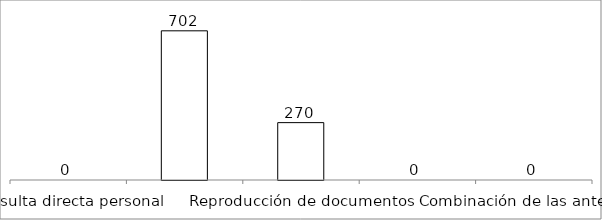
| Category | Series 0 |
|---|---|
| Consulta directa personal | 0 |
| Consulta directa electrónica | 702 |
| Reproducción de documentos | 270 |
| Elaboración de informes | 0 |
| Combinación de las anteriores | 0 |